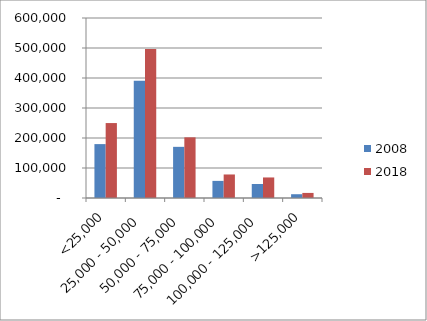
| Category | 2008 | 2018 |
|---|---|---|
| <25,000 | 179661.15 | 249792.131 |
| 25,000 - 50,000 | 391087.492 | 496970.522 |
| 50,000 - 75,000 | 170513.103 | 202209.388 |
| 75,000 - 100,000 | 57036.49 | 78418.314 |
| 100,000 - 125,000 | 46667.979 | 68482.013 |
| >125,000 | 12600.261 | 16937.186 |